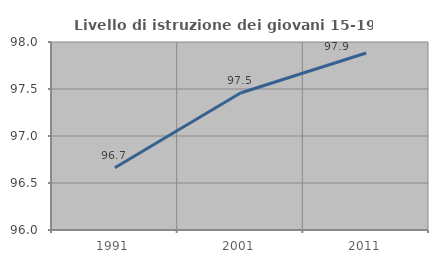
| Category | Livello di istruzione dei giovani 15-19 anni |
|---|---|
| 1991.0 | 96.663 |
| 2001.0 | 97.458 |
| 2011.0 | 97.883 |